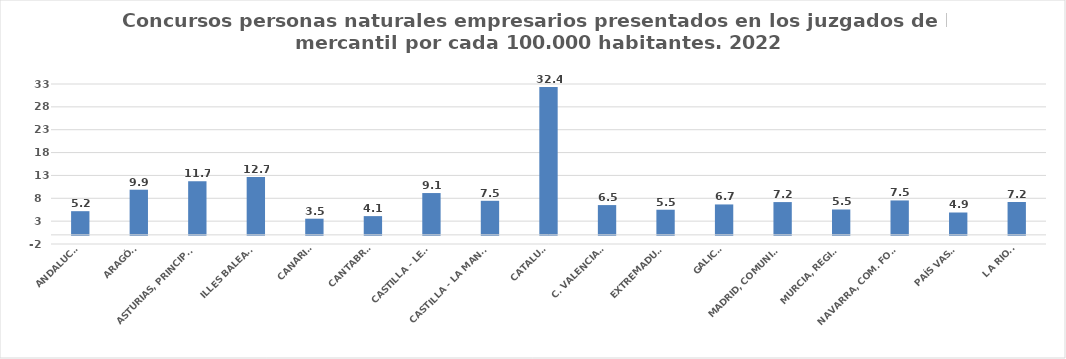
| Category | Series 0 |
|---|---|
| ANDALUCÍA | 5.18 |
| ARAGÓN | 9.877 |
| ASTURIAS, PRINCIPADO | 11.745 |
| ILLES BALEARS | 12.663 |
| CANARIAS | 3.536 |
| CANTABRIA | 4.1 |
| CASTILLA - LEÓN | 9.146 |
| CASTILLA - LA MANCHA | 7.451 |
| CATALUÑA | 32.364 |
| C. VALENCIANA | 6.512 |
| EXTREMADURA | 5.499 |
| GALICIA | 6.653 |
| MADRID, COMUNIDAD | 7.17 |
| MURCIA, REGIÓN | 5.549 |
| NAVARRA, COM. FORAL | 7.529 |
| PAÍS VASCO | 4.891 |
| LA RIOJA | 7.19 |